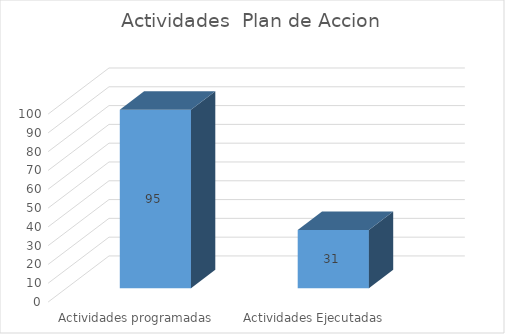
| Category | Series 0 |
|---|---|
| Actividades programadas | 95 |
| Actividades Ejecutadas | 31 |